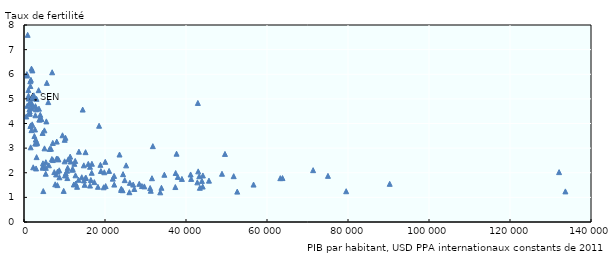
| Category | PIB par habitant, USD PPA internationaux constants de 2011, 2014 |
|---|---|
| 1844.0215029792078 | 4.843 |
| 10698.524698605026 | 1.784 |
| 13553.906065552139 | 2.857 |
| 6955.960047153764 | 6.08 |
| 21011.811360252734 | 2.075 |
| 18872.966610011255 | 2.322 |
| 7706.132933774364 | 1.531 |
| 43273.85764220663 | 1.859 |
| 44122.65040654405 | 1.44 |
| 16715.105521305817 | 2 |
| 22252.890037207017 | 1.872 |
| 43014.1798834694 | 2.056 |
| 2979.1672697898866 | 2.175 |
| 15318.61423983756 | 1.794 |
| 17363.59864167935 | 1.62 |
| 41274.46739415456 | 1.75 |
| 8055.42888025849 | 2.579 |
| 1942.2629917284244 | 4.766 |
| 7476.582310424275 | 2.027 |
| 6325.0689910339215 | 2.968 |
| 9802.365697105071 | 1.263 |
| 15200.238708240076 | 2.836 |
| 15162.417784944435 | 1.79 |
| 75052.02192579591 | 1.874 |
| 16302.28880976892 | 1.48 |
| 1576.2969160341133 | 5.521 |
| 734.4845954581168 | 5.948 |
| 6147.508198003328 | 2.303 |
| 3112.630513136922 | 2.635 |
| 2835.566676959583 | 4.704 |
| 42800.085036351455 | 1.61 |
| 565.5954357347807 | 4.286 |
| 2073.957725129188 | 6.156 |
| 21923.38641598965 | 1.761 |
| 12758.648671393434 | 1.562 |
| 12715.143235980637 | 1.897 |
| 1412.362889955786 | 4.49 |
| 711.016949690599 | 6.006 |
| 5988.158822692546 | 4.869 |
| 14266.381619511789 | 1.819 |
| 3097.341369455175 | 5.001 |
| 20162.738901185807 | 1.46 |
| 29711.2591881637 | 1.446 |
| 29119.61661190741 | 1.46 |
| 43920.016954419814 | 1.67 |
| 3120.0443279978717 | 3.195 |
| 12638.971303691642 | 2.48 |
| 10922.963419000176 | 2.542 |
| 10048.572427979301 | 3.338 |
| 7925.991783020603 | 1.931 |
| 42926.02595270842 | 4.835 |
| 26957.23744026939 | 1.52 |
| 1430.8034434478693 | 4.395 |
| 8348.206771513886 | 2.564 |
| 38987.4196245101 | 1.75 |
| 37451.37678786198 | 1.99 |
| 18536.76836811049 | 3.909 |
| 1555.5293485262312 | 5.717 |
| 8749.156145118743 | 1.816 |
| 43417.730614879554 | 1.39 |
| 3894.004398533406 | 4.168 |
| 23989.13624430907 | 1.3 |
| 12041.244202924434 | 2.149 |
| 7106.392330641386 | 3.211 |
| 1165.1298195280297 | 5.013 |
| 1336.4623911898857 | 4.835 |
| 6886.96028322437 | 2.558 |
| 1652.7090019395378 | 3.033 |
| 4682.9903503929645 | 2.382 |
| 52652.32438275574 | 1.234 |
| 24016.30037791533 | 1.35 |
| 41139.90586452457 | 1.93 |
| 5391.694148070257 | 2.427 |
| 10031.321952321572 | 2.463 |
| 16507.024248116035 | 1.707 |
| 14492.624795846335 | 4.566 |
| 48885.61980634617 | 1.96 |
| 31812.628750315947 | 3.08 |
| 33938.45960959225 | 1.39 |
| 8281.00719164161 | 2.046 |
| 37365.182218517206 | 1.42 |
| 10242.040492412892 | 3.422 |
| 23586.05645649377 | 2.74 |
| 2818.525658376671 | 4.334 |
| 1842.1960487707083 | 3.73 |
| 33639.60762688479 | 1.205 |
| 8701.070034590795 | 2.1 |
| 71385.34753081315 | 2.105 |
| 3181.6421629226516 | 3.2 |
| 5063.1729341407245 | 2.991 |
| 22282.02568424449 | 1.52 |
| 13470.488969800599 | 1.714 |
| 2759.634242612766 | 3.185 |
| 803.6551766170215 | 4.719 |
| 26133.649019606662 | 1.59 |
| 90297.55701608793 | 1.55 |
| 133675.7849788197 | 1.243 |
| 12298.95893231371 | 1.524 |
| 1373.0737957027984 | 4.409 |
| 1114.7660492647947 | 5.129 |
| 24459.711289374194 | 1.944 |
| 11899.334479537478 | 2.123 |
| 1851.7143658938592 | 6.229 |
| 31148.09011856913 | 1.38 |
| 3693.5420412279746 | 4.603 |
| 18255.869726977657 | 1.43 |
| 16303.038437874457 | 2.243 |
| 3177.3925909761783 | 3.243 |
| 4762.780872674295 | 1.256 |
| 11403.34551124298 | 2.655 |
| 14796.599661696511 | 1.689 |
| 7142.65688606206 | 2.515 |
| 1079.6670366765293 | 5.359 |
| 4634.9577894613385 | 2.204 |
| 9502.978783498389 | 3.522 |
| 2278.1300015470492 | 2.222 |
| 45668.44147213223 | 1.68 |
| 34653.329476706895 | 1.92 |
| 4707.445226917037 | 2.264 |
| 901.7585957483667 | 7.599 |
| 5639.447041107004 | 5.65 |
| 63286.68810742255 | 1.78 |
| 37667.035762863394 | 2.774 |
| 4588.640980140292 | 3.617 |
| 20059.12745722049 | 2.444 |
| 2723.493095134757 | 3.757 |
| 8501.62917108112 | 2.542 |
| 11545.464428700978 | 2.455 |
| 6654.487606893215 | 2.977 |
| 24346.206561940657 | 1.29 |
| 26026.949482280546 | 1.21 |
| 132119.63764974265 | 2.026 |
| 19667.005430908423 | 1.41 |
| 24873.8850109897 | 1.7 |
| 1584.8814212974883 | 3.898 |
| 5523.946700671816 | 4.086 |
| 2969.825501243182 | 4.576 |
| 49618.85434189443 | 2.765 |
| 2201.616671898319 | 5.09 |
| 13112.861169513308 | 1.43 |
| 25218.409090783156 | 2.3 |
| 1896.7155311487952 | 4.626 |
| 79550.90076937167 | 1.25 |
| 27237.623232656988 | 1.34 |
| 28459.914344242334 | 1.55 |
| 2032.485806877897 | 3.966 |
| 12434.047098115305 | 2.363 |
| 1926.0521556633814 | 5.022 |
| 31297.925658249722 | 1.27 |
| 10642.056283557753 | 2.083 |
| 10115.0386311722 | 1.89 |
| 10306.9396765127 | 1.974 |
| 4016.71954877409 | 4.353 |
| 15872.614774847742 | 2.36 |
| 8085.36667436993 | 3.266 |
| 44167.631866989126 | 1.89 |
| 56680.43649940901 | 1.52 |
| 2567.0377184205954 | 3.49 |
| 2421.20802776932 | 5.145 |
| 14975.960223394464 | 1.512 |
| 2211.4288969805816 | 5.1 |
| 1336.36895351361 | 4.584 |
| 5040.294113500951 | 3.722 |
| 31595.793277109642 | 1.778 |
| 10782.096169291566 | 2.2 |
| 18992.781437666225 | 2.07 |
| 14761.897524278449 | 2.301 |
| 1708.0888745857123 | 5.775 |
| 8243.47351509088 | 1.498 |
| 63830.70035797946 | 1.784 |
| 37983.1331850652 | 1.83 |
| 51775.09029512128 | 1.862 |
| 19827.738939228915 | 2.02 |
| 5386.186169916204 | 2.2 |
| 2891.9729155110563 | 3.347 |
| 16769.326784511708 | 2.365 |
| 5370.209979935822 | 1.961 |
| 4319.528289997346 | 4.176 |
| 3775.819027377115 | 4.16 |
| 3609.3129375410717 | 5.353 |
| 1709.1440017323744 | 3.923 |